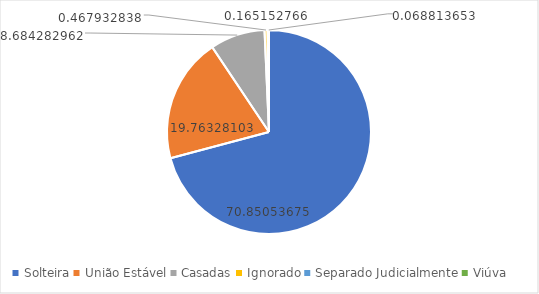
| Category | Series 0 |
|---|---|
| Solteira | 70.851 |
| União Estável | 19.763 |
| Casadas | 8.684 |
| Ignorado | 0.468 |
| Separado Judicialmente | 0.165 |
| Viúva | 0.069 |